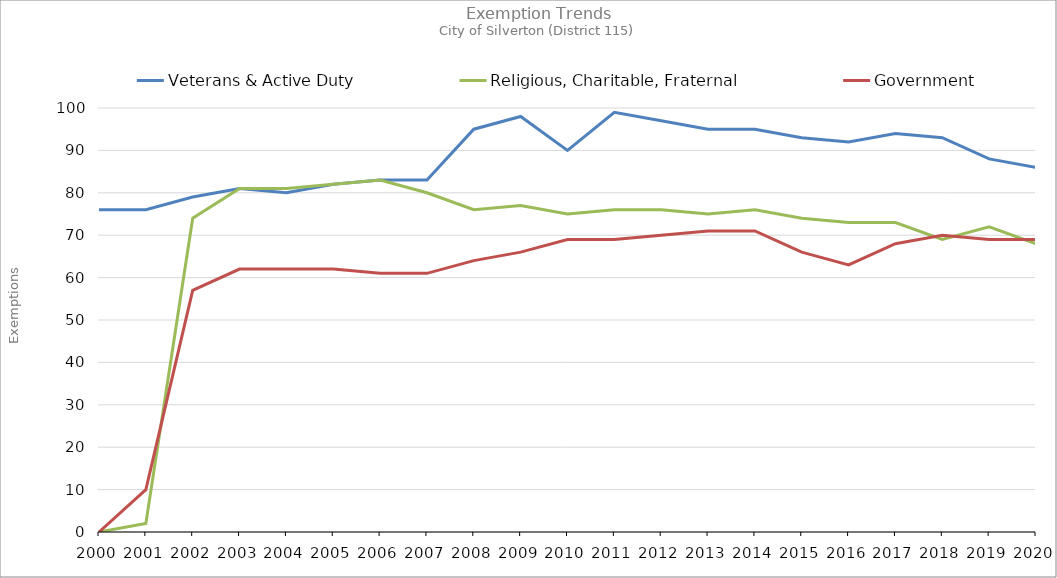
| Category | Veterans & Active Duty | Religious, Charitable, Fraternal | Government |
|---|---|---|---|
| 2000.0 | 76 | 0 | 0 |
| 2001.0 | 76 | 2 | 10 |
| 2002.0 | 79 | 74 | 57 |
| 2003.0 | 81 | 81 | 62 |
| 2004.0 | 80 | 81 | 62 |
| 2005.0 | 82 | 82 | 62 |
| 2006.0 | 83 | 83 | 61 |
| 2007.0 | 83 | 80 | 61 |
| 2008.0 | 95 | 76 | 64 |
| 2009.0 | 98 | 77 | 66 |
| 2010.0 | 90 | 75 | 69 |
| 2011.0 | 99 | 76 | 69 |
| 2012.0 | 97 | 76 | 70 |
| 2013.0 | 95 | 75 | 71 |
| 2014.0 | 95 | 76 | 71 |
| 2015.0 | 93 | 74 | 66 |
| 2016.0 | 92 | 73 | 63 |
| 2017.0 | 94 | 73 | 68 |
| 2018.0 | 93 | 69 | 70 |
| 2019.0 | 88 | 72 | 69 |
| 2020.0 | 86 | 68 | 69 |